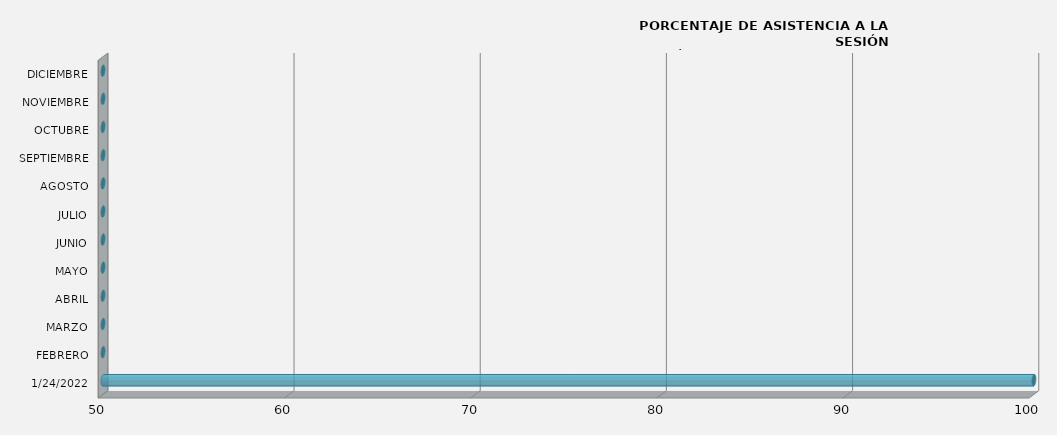
| Category | Series 0 |
|---|---|
| 24/01/2022 | 100 |
| FEBRERO | 0 |
| MARZO | 0 |
| ABRIL | 0 |
| MAYO | 0 |
| JUNIO | 0 |
| JULIO | 0 |
| AGOSTO | 0 |
| SEPTIEMBRE | 0 |
| OCTUBRE | 0 |
| NOVIEMBRE | 0 |
| DICIEMBRE | 0 |